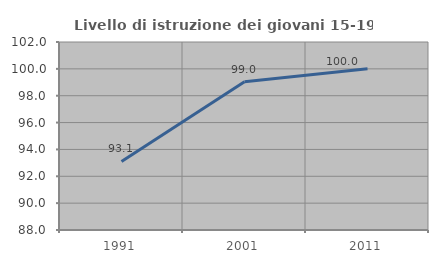
| Category | Livello di istruzione dei giovani 15-19 anni |
|---|---|
| 1991.0 | 93.103 |
| 2001.0 | 99.048 |
| 2011.0 | 100 |